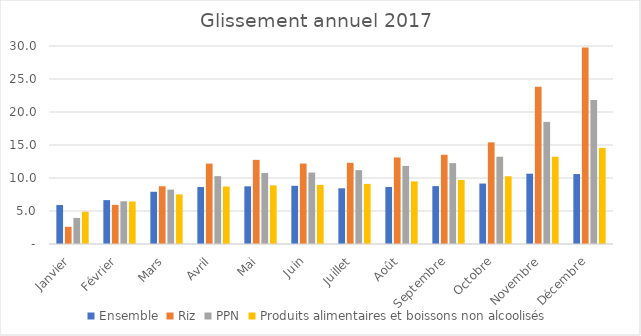
| Category | Ensemble | Riz | PPN | Produits alimentaires et boissons non alcoolisés |
|---|---|---|---|---|
| Janvier | 5.902 | 2.606 | 3.95 | 4.895 |
| Février | 6.647 | 5.931 | 6.474 | 6.44 |
| Mars | 7.913 | 8.749 | 8.239 | 7.516 |
| Avril | 8.631 | 12.183 | 10.287 | 8.712 |
| Mai | 8.738 | 12.747 | 10.773 | 8.89 |
| Juin | 8.817 | 12.189 | 10.82 | 8.96 |
| Juillet | 8.442 | 12.307 | 11.189 | 9.107 |
| Août | 8.637 | 13.111 | 11.827 | 9.485 |
| Septembre | 8.771 | 13.519 | 12.255 | 9.696 |
| Octobre | 9.159 | 15.398 | 13.223 | 10.263 |
| Novembre | 10.653 | 23.831 | 18.503 | 13.221 |
| Décembre | 10.598 | 29.783 | 21.822 | 14.562 |